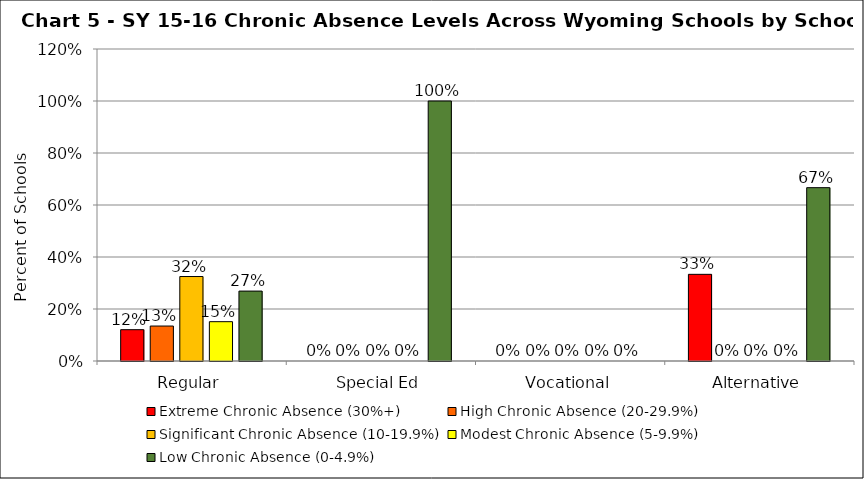
| Category | Extreme Chronic Absence (30%+) | High Chronic Absence (20-29.9%) | Significant Chronic Absence (10-19.9%) | Modest Chronic Absence (5-9.9%) | Low Chronic Absence (0-4.9%) |
|---|---|---|---|---|---|
| 0 | 0.12 | 0.134 | 0.325 | 0.151 | 0.269 |
| 1 | 0 | 0 | 0 | 0 | 1 |
| 2 | 0 | 0 | 0 | 0 | 0 |
| 3 | 0.333 | 0 | 0 | 0 | 0.667 |